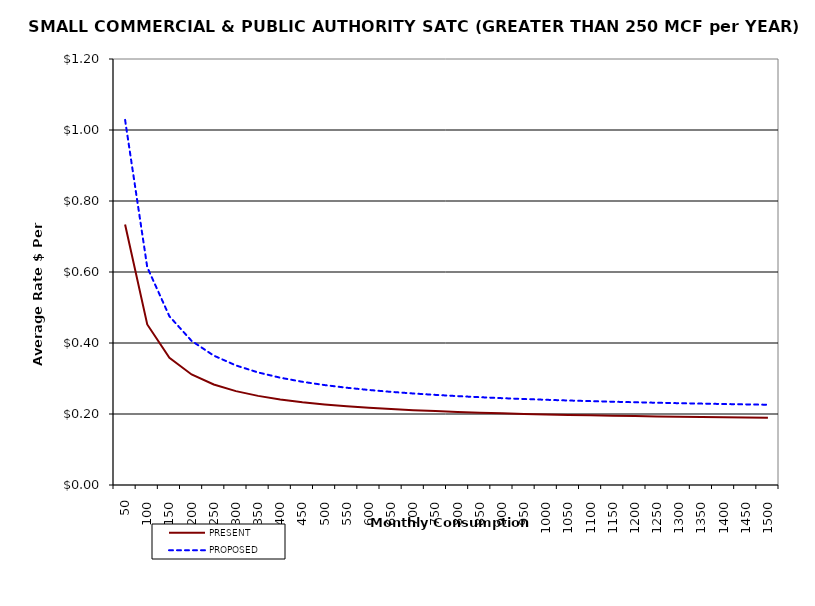
| Category | PRESENT | PROPOSED |
|---|---|---|
| 50.0 | 0.734 | 1.029 |
| 100.0 | 0.452 | 0.614 |
| 150.0 | 0.358 | 0.475 |
| 200.0 | 0.311 | 0.406 |
| 250.0 | 0.283 | 0.365 |
| 300.0 | 0.264 | 0.337 |
| 350.0 | 0.251 | 0.317 |
| 400.0 | 0.241 | 0.302 |
| 450.0 | 0.233 | 0.291 |
| 500.0 | 0.227 | 0.282 |
| 550.0 | 0.222 | 0.274 |
| 600.0 | 0.218 | 0.268 |
| 650.0 | 0.214 | 0.262 |
| 700.0 | 0.211 | 0.258 |
| 750.0 | 0.208 | 0.254 |
| 800.0 | 0.206 | 0.25 |
| 850.0 | 0.204 | 0.247 |
| 900.0 | 0.202 | 0.245 |
| 950.0 | 0.2 | 0.242 |
| 1000.0 | 0.199 | 0.24 |
| 1050.0 | 0.197 | 0.238 |
| 1100.0 | 0.196 | 0.236 |
| 1150.0 | 0.195 | 0.235 |
| 1200.0 | 0.194 | 0.233 |
| 1250.0 | 0.193 | 0.232 |
| 1300.0 | 0.192 | 0.23 |
| 1350.0 | 0.191 | 0.229 |
| 1400.0 | 0.191 | 0.228 |
| 1450.0 | 0.19 | 0.227 |
| 1500.0 | 0.189 | 0.226 |